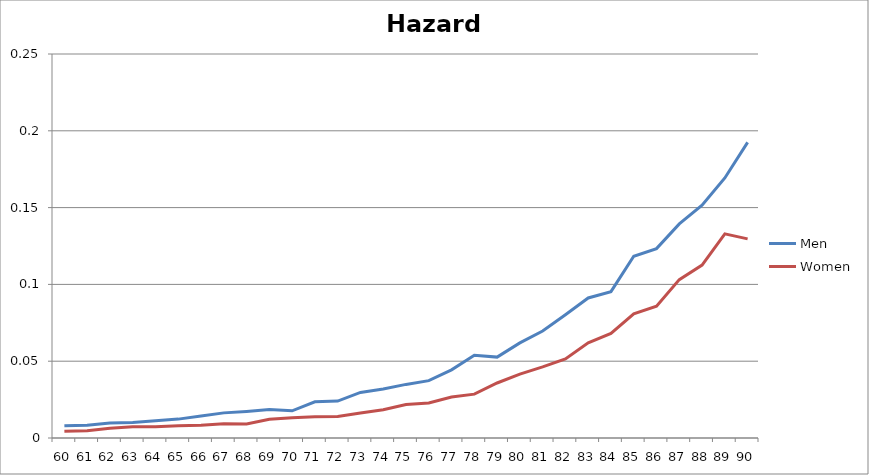
| Category | Men | Women |
|---|---|---|
| 60.0 | 0.008 | 0.004 |
| 61.0 | 0.008 | 0.005 |
| 62.0 | 0.01 | 0.006 |
| 63.0 | 0.01 | 0.007 |
| 64.0 | 0.011 | 0.007 |
| 65.0 | 0.012 | 0.008 |
| 66.0 | 0.014 | 0.008 |
| 67.0 | 0.016 | 0.009 |
| 68.0 | 0.017 | 0.009 |
| 69.0 | 0.019 | 0.012 |
| 70.0 | 0.018 | 0.013 |
| 71.0 | 0.024 | 0.014 |
| 72.0 | 0.024 | 0.014 |
| 73.0 | 0.03 | 0.016 |
| 74.0 | 0.032 | 0.018 |
| 75.0 | 0.035 | 0.022 |
| 76.0 | 0.037 | 0.023 |
| 77.0 | 0.044 | 0.027 |
| 78.0 | 0.054 | 0.029 |
| 79.0 | 0.053 | 0.036 |
| 80.0 | 0.062 | 0.042 |
| 81.0 | 0.07 | 0.046 |
| 82.0 | 0.08 | 0.051 |
| 83.0 | 0.091 | 0.062 |
| 84.0 | 0.095 | 0.068 |
| 85.0 | 0.118 | 0.081 |
| 86.0 | 0.123 | 0.086 |
| 87.0 | 0.139 | 0.103 |
| 88.0 | 0.152 | 0.113 |
| 89.0 | 0.169 | 0.133 |
| 90.0 | 0.192 | 0.13 |